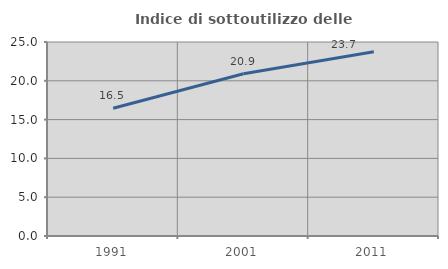
| Category | Indice di sottoutilizzo delle abitazioni  |
|---|---|
| 1991.0 | 16.459 |
| 2001.0 | 20.91 |
| 2011.0 | 23.734 |